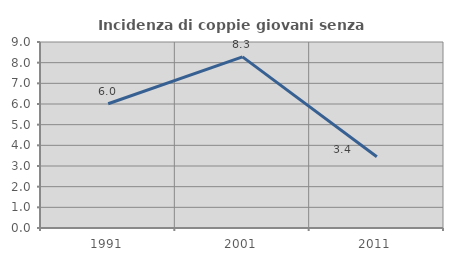
| Category | Incidenza di coppie giovani senza figli |
|---|---|
| 1991.0 | 6.014 |
| 2001.0 | 8.281 |
| 2011.0 | 3.448 |